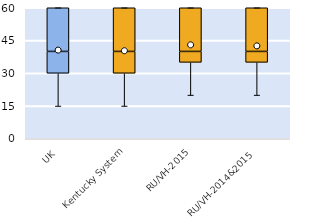
| Category | 25th | 50th | 75th |
|---|---|---|---|
| UK | 30 | 10 | 20 |
| Kentucky System | 30 | 10 | 20 |
| RU/VH-2015 | 35 | 5 | 20 |
| RU/VH-2014&2015 | 35 | 5 | 20 |